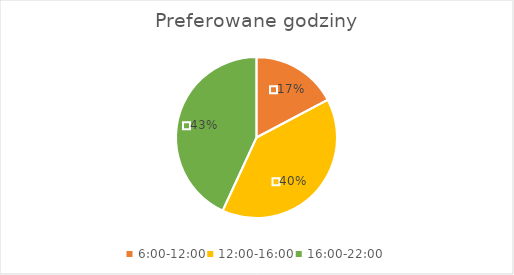
| Category | Preferowane godziny |
|---|---|
| 6:00-12:00 | 20 |
| 12:00-16:00 | 46 |
| 16:00-22:00 | 50 |